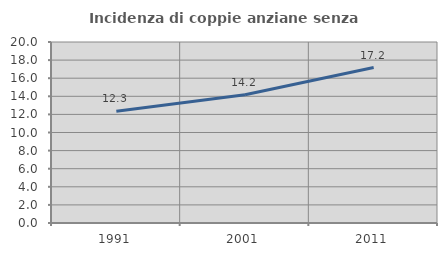
| Category | Incidenza di coppie anziane senza figli  |
|---|---|
| 1991.0 | 12.342 |
| 2001.0 | 14.169 |
| 2011.0 | 17.175 |